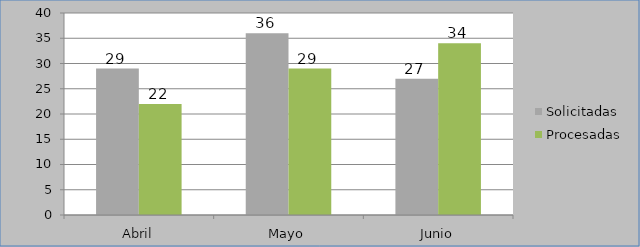
| Category | Solicitadas | Procesadas |
|---|---|---|
| Abril | 29 | 22 |
| Mayo | 36 | 29 |
| Junio | 27 | 34 |